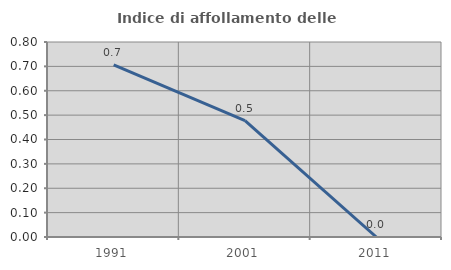
| Category | Indice di affollamento delle abitazioni  |
|---|---|
| 1991.0 | 0.706 |
| 2001.0 | 0.477 |
| 2011.0 | 0 |